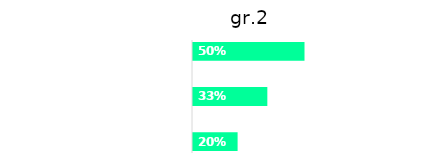
| Category | gr.2 |
|---|---|
| mondelinge taalvaardigheid | 0.2 |
| verhalen | 0 |
| klanken en letters | 0.333 |
| krabbelen en schrijven | 0 |
| woordenschat | 0.5 |